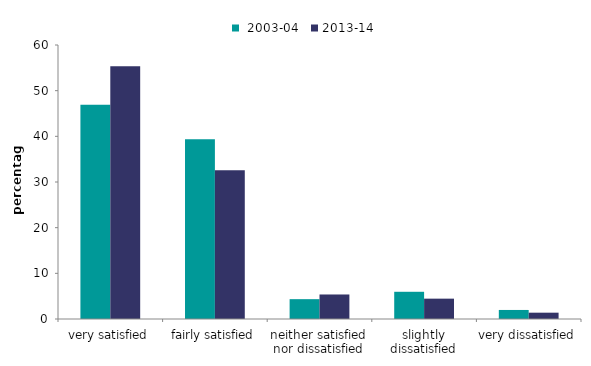
| Category |  2003-04 | 2013-14 |
|---|---|---|
| very satisfied | 46.923 | 55.348 |
| fairly satisfied | 39.341 | 32.588 |
| neither satisfied nor dissatisfied | 4.343 | 5.369 |
| slightly dissatisfied | 5.96 | 4.455 |
| very dissatisfied | 1.98 | 1.384 |